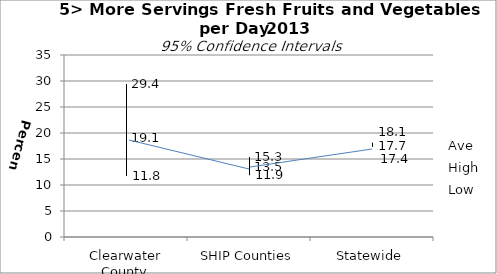
| Category | Ave | High | Low |
|---|---|---|---|
| Clearwater County | 19.1 | 29.4 | 11.8 |
| SHIP Counties | 13.5 | 15.3 | 11.9 |
| Statewide | 17.7 | 18.1 | 17.4 |